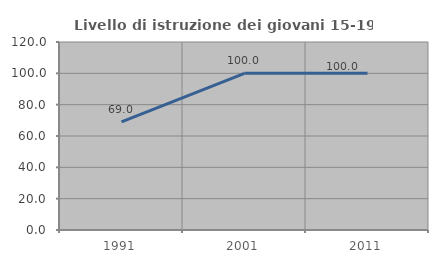
| Category | Livello di istruzione dei giovani 15-19 anni |
|---|---|
| 1991.0 | 68.966 |
| 2001.0 | 100 |
| 2011.0 | 100 |